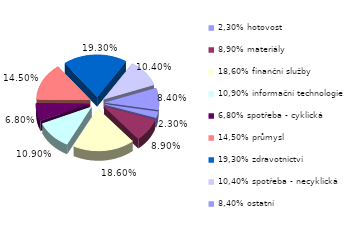
| Category | Series 0 |
|---|---|
| 2,30% hotovost | 0.023 |
| 8,90% materiály | 0.089 |
| 18,60% finanční služby | 0.186 |
| 10,90% informační technologie | 0.109 |
| 6,80% spotřeba - cyklická | 0.068 |
| 14,50% průmysl | 0.145 |
| 19,30% zdravotnictví | 0.193 |
| 10,40% spotřeba - necyklická | 0.104 |
| 8,40% ostatní | 0.084 |